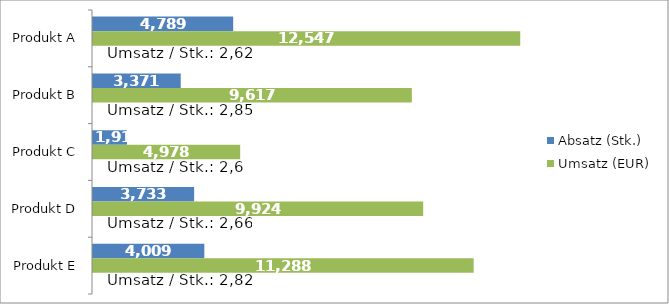
| Category | Absatz (Stk.) | Umsatz (EUR) | Legende |
|---|---|---|---|
| Produkt A | 4789 | 12547 | 12547 |
| Produkt B | 3371 | 9617 | 9617 |
| Produkt C | 1918 | 4978 | 4978 |
| Produkt D | 3733 | 9924 | 9924 |
| Produkt E | 4009 | 11288 | 11288 |